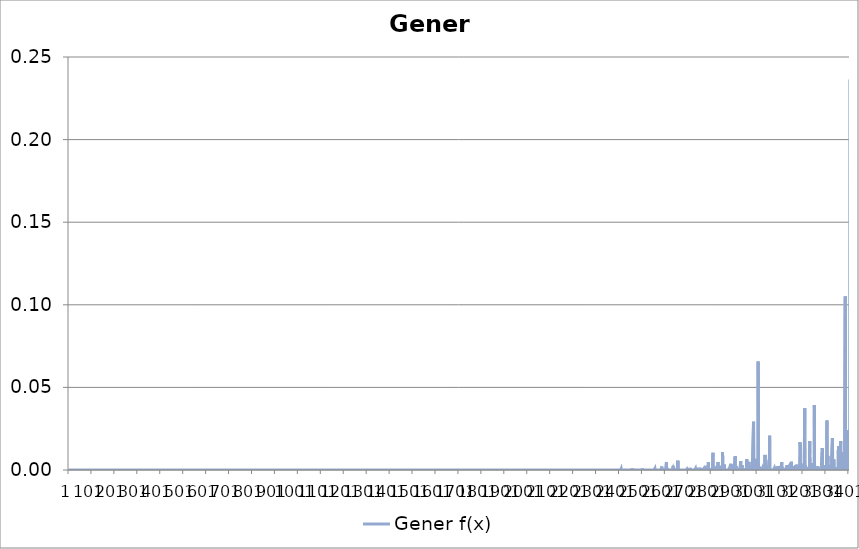
| Category | Gener f(x) |
|---|---|
| 0 | 0 |
| 1 | 0 |
| 2 | 0 |
| 3 | 0 |
| 4 | 0 |
| 5 | 0 |
| 6 | 0 |
| 7 | 0 |
| 8 | 0 |
| 9 | 0 |
| 10 | 0 |
| 11 | 0 |
| 12 | 0 |
| 13 | 0 |
| 14 | 0 |
| 15 | 0 |
| 16 | 0 |
| 17 | 0 |
| 18 | 0 |
| 19 | 0 |
| 20 | 0 |
| 21 | 0 |
| 22 | 0 |
| 23 | 0 |
| 24 | 0 |
| 25 | 0 |
| 26 | 0 |
| 27 | 0 |
| 28 | 0 |
| 29 | 0 |
| 30 | 0 |
| 31 | 0 |
| 32 | 0 |
| 33 | 0 |
| 34 | 0 |
| 35 | 0 |
| 36 | 0 |
| 37 | 0 |
| 38 | 0 |
| 39 | 0 |
| 40 | 0 |
| 41 | 0 |
| 42 | 0 |
| 43 | 0 |
| 44 | 0 |
| 45 | 0 |
| 46 | 0 |
| 47 | 0 |
| 48 | 0 |
| 49 | 0 |
| 50 | 0 |
| 51 | 0 |
| 52 | 0 |
| 53 | 0 |
| 54 | 0 |
| 55 | 0 |
| 56 | 0 |
| 57 | 0 |
| 58 | 0 |
| 59 | 0 |
| 60 | 0 |
| 61 | 0 |
| 62 | 0 |
| 63 | 0 |
| 64 | 0 |
| 65 | 0 |
| 66 | 0 |
| 67 | 0 |
| 68 | 0 |
| 69 | 0 |
| 70 | 0 |
| 71 | 0 |
| 72 | 0 |
| 73 | 0 |
| 74 | 0 |
| 75 | 0 |
| 76 | 0 |
| 77 | 0 |
| 78 | 0 |
| 79 | 0 |
| 80 | 0 |
| 81 | 0 |
| 82 | 0 |
| 83 | 0 |
| 84 | 0 |
| 85 | 0 |
| 86 | 0 |
| 87 | 0 |
| 88 | 0 |
| 89 | 0 |
| 90 | 0 |
| 91 | 0 |
| 92 | 0 |
| 93 | 0 |
| 94 | 0 |
| 95 | 0 |
| 96 | 0 |
| 97 | 0 |
| 98 | 0 |
| 99 | 0 |
| 100 | 0 |
| 101 | 0 |
| 102 | 0 |
| 103 | 0 |
| 104 | 0 |
| 105 | 0 |
| 106 | 0 |
| 107 | 0 |
| 108 | 0 |
| 109 | 0 |
| 110 | 0 |
| 111 | 0 |
| 112 | 0 |
| 113 | 0 |
| 114 | 0 |
| 115 | 0 |
| 116 | 0 |
| 117 | 0 |
| 118 | 0 |
| 119 | 0 |
| 120 | 0 |
| 121 | 0 |
| 122 | 0 |
| 123 | 0 |
| 124 | 0 |
| 125 | 0 |
| 126 | 0 |
| 127 | 0 |
| 128 | 0 |
| 129 | 0 |
| 130 | 0 |
| 131 | 0 |
| 132 | 0 |
| 133 | 0 |
| 134 | 0 |
| 135 | 0 |
| 136 | 0 |
| 137 | 0 |
| 138 | 0 |
| 139 | 0 |
| 140 | 0 |
| 141 | 0 |
| 142 | 0 |
| 143 | 0 |
| 144 | 0 |
| 145 | 0 |
| 146 | 0 |
| 147 | 0 |
| 148 | 0 |
| 149 | 0 |
| 150 | 0 |
| 151 | 0 |
| 152 | 0 |
| 153 | 0 |
| 154 | 0 |
| 155 | 0 |
| 156 | 0 |
| 157 | 0 |
| 158 | 0 |
| 159 | 0 |
| 160 | 0 |
| 161 | 0 |
| 162 | 0 |
| 163 | 0 |
| 164 | 0 |
| 165 | 0 |
| 166 | 0 |
| 167 | 0 |
| 168 | 0 |
| 169 | 0 |
| 170 | 0 |
| 171 | 0 |
| 172 | 0 |
| 173 | 0 |
| 174 | 0 |
| 175 | 0 |
| 176 | 0 |
| 177 | 0 |
| 178 | 0 |
| 179 | 0 |
| 180 | 0 |
| 181 | 0 |
| 182 | 0 |
| 183 | 0 |
| 184 | 0 |
| 185 | 0 |
| 186 | 0 |
| 187 | 0 |
| 188 | 0 |
| 189 | 0 |
| 190 | 0 |
| 191 | 0 |
| 192 | 0 |
| 193 | 0 |
| 194 | 0 |
| 195 | 0 |
| 196 | 0 |
| 197 | 0 |
| 198 | 0 |
| 199 | 0 |
| 200 | 0 |
| 201 | 0 |
| 202 | 0 |
| 203 | 0 |
| 204 | 0 |
| 205 | 0 |
| 206 | 0 |
| 207 | 0 |
| 208 | 0 |
| 209 | 0 |
| 210 | 0 |
| 211 | 0 |
| 212 | 0 |
| 213 | 0 |
| 214 | 0 |
| 215 | 0 |
| 216 | 0 |
| 217 | 0 |
| 218 | 0 |
| 219 | 0 |
| 220 | 0 |
| 221 | 0 |
| 222 | 0 |
| 223 | 0 |
| 224 | 0 |
| 225 | 0 |
| 226 | 0 |
| 227 | 0 |
| 228 | 0 |
| 229 | 0 |
| 230 | 0 |
| 231 | 0 |
| 232 | 0 |
| 233 | 0 |
| 234 | 0 |
| 235 | 0 |
| 236 | 0 |
| 237 | 0 |
| 238 | 0 |
| 239 | 0 |
| 240 | 0 |
| 241 | 0 |
| 242 | 0 |
| 243 | 0 |
| 244 | 0 |
| 245 | 0 |
| 246 | 0 |
| 247 | 0 |
| 248 | 0 |
| 249 | 0 |
| 250 | 0 |
| 251 | 0 |
| 252 | 0 |
| 253 | 0 |
| 254 | 0 |
| 255 | 0 |
| 256 | 0 |
| 257 | 0 |
| 258 | 0 |
| 259 | 0 |
| 260 | 0 |
| 261 | 0 |
| 262 | 0 |
| 263 | 0 |
| 264 | 0 |
| 265 | 0 |
| 266 | 0 |
| 267 | 0 |
| 268 | 0 |
| 269 | 0 |
| 270 | 0 |
| 271 | 0 |
| 272 | 0 |
| 273 | 0 |
| 274 | 0 |
| 275 | 0 |
| 276 | 0 |
| 277 | 0 |
| 278 | 0 |
| 279 | 0 |
| 280 | 0 |
| 281 | 0 |
| 282 | 0 |
| 283 | 0 |
| 284 | 0 |
| 285 | 0 |
| 286 | 0 |
| 287 | 0 |
| 288 | 0 |
| 289 | 0 |
| 290 | 0 |
| 291 | 0 |
| 292 | 0 |
| 293 | 0 |
| 294 | 0 |
| 295 | 0 |
| 296 | 0 |
| 297 | 0 |
| 298 | 0 |
| 299 | 0 |
| 300 | 0 |
| 301 | 0 |
| 302 | 0 |
| 303 | 0 |
| 304 | 0 |
| 305 | 0 |
| 306 | 0 |
| 307 | 0 |
| 308 | 0 |
| 309 | 0 |
| 310 | 0 |
| 311 | 0 |
| 312 | 0 |
| 313 | 0 |
| 314 | 0 |
| 315 | 0 |
| 316 | 0 |
| 317 | 0 |
| 318 | 0 |
| 319 | 0 |
| 320 | 0 |
| 321 | 0 |
| 322 | 0 |
| 323 | 0 |
| 324 | 0 |
| 325 | 0 |
| 326 | 0 |
| 327 | 0 |
| 328 | 0 |
| 329 | 0 |
| 330 | 0 |
| 331 | 0 |
| 332 | 0 |
| 333 | 0 |
| 334 | 0 |
| 335 | 0 |
| 336 | 0 |
| 337 | 0 |
| 338 | 0 |
| 339 | 0 |
| 340 | 0 |
| 341 | 0 |
| 342 | 0 |
| 343 | 0 |
| 344 | 0 |
| 345 | 0 |
| 346 | 0 |
| 347 | 0 |
| 348 | 0 |
| 349 | 0 |
| 350 | 0 |
| 351 | 0 |
| 352 | 0 |
| 353 | 0 |
| 354 | 0 |
| 355 | 0 |
| 356 | 0 |
| 357 | 0 |
| 358 | 0 |
| 359 | 0 |
| 360 | 0 |
| 361 | 0 |
| 362 | 0 |
| 363 | 0 |
| 364 | 0 |
| 365 | 0 |
| 366 | 0 |
| 367 | 0 |
| 368 | 0 |
| 369 | 0 |
| 370 | 0 |
| 371 | 0 |
| 372 | 0 |
| 373 | 0 |
| 374 | 0 |
| 375 | 0 |
| 376 | 0 |
| 377 | 0 |
| 378 | 0 |
| 379 | 0 |
| 380 | 0 |
| 381 | 0 |
| 382 | 0 |
| 383 | 0 |
| 384 | 0 |
| 385 | 0 |
| 386 | 0 |
| 387 | 0 |
| 388 | 0 |
| 389 | 0 |
| 390 | 0 |
| 391 | 0 |
| 392 | 0 |
| 393 | 0 |
| 394 | 0 |
| 395 | 0 |
| 396 | 0 |
| 397 | 0 |
| 398 | 0 |
| 399 | 0 |
| 400 | 0 |
| 401 | 0 |
| 402 | 0 |
| 403 | 0 |
| 404 | 0 |
| 405 | 0 |
| 406 | 0 |
| 407 | 0 |
| 408 | 0 |
| 409 | 0 |
| 410 | 0 |
| 411 | 0 |
| 412 | 0 |
| 413 | 0 |
| 414 | 0 |
| 415 | 0 |
| 416 | 0 |
| 417 | 0 |
| 418 | 0 |
| 419 | 0 |
| 420 | 0 |
| 421 | 0 |
| 422 | 0 |
| 423 | 0 |
| 424 | 0 |
| 425 | 0 |
| 426 | 0 |
| 427 | 0 |
| 428 | 0 |
| 429 | 0 |
| 430 | 0 |
| 431 | 0 |
| 432 | 0 |
| 433 | 0 |
| 434 | 0 |
| 435 | 0 |
| 436 | 0 |
| 437 | 0 |
| 438 | 0 |
| 439 | 0 |
| 440 | 0 |
| 441 | 0 |
| 442 | 0 |
| 443 | 0 |
| 444 | 0 |
| 445 | 0 |
| 446 | 0 |
| 447 | 0 |
| 448 | 0 |
| 449 | 0 |
| 450 | 0 |
| 451 | 0 |
| 452 | 0 |
| 453 | 0 |
| 454 | 0 |
| 455 | 0 |
| 456 | 0 |
| 457 | 0 |
| 458 | 0 |
| 459 | 0 |
| 460 | 0 |
| 461 | 0 |
| 462 | 0 |
| 463 | 0 |
| 464 | 0 |
| 465 | 0 |
| 466 | 0 |
| 467 | 0 |
| 468 | 0 |
| 469 | 0 |
| 470 | 0 |
| 471 | 0 |
| 472 | 0 |
| 473 | 0 |
| 474 | 0 |
| 475 | 0 |
| 476 | 0 |
| 477 | 0 |
| 478 | 0 |
| 479 | 0 |
| 480 | 0 |
| 481 | 0 |
| 482 | 0 |
| 483 | 0 |
| 484 | 0 |
| 485 | 0 |
| 486 | 0 |
| 487 | 0 |
| 488 | 0 |
| 489 | 0 |
| 490 | 0 |
| 491 | 0 |
| 492 | 0 |
| 493 | 0 |
| 494 | 0 |
| 495 | 0 |
| 496 | 0 |
| 497 | 0 |
| 498 | 0 |
| 499 | 0 |
| 500 | 0 |
| 501 | 0 |
| 502 | 0 |
| 503 | 0 |
| 504 | 0 |
| 505 | 0 |
| 506 | 0 |
| 507 | 0 |
| 508 | 0 |
| 509 | 0 |
| 510 | 0 |
| 511 | 0 |
| 512 | 0 |
| 513 | 0 |
| 514 | 0 |
| 515 | 0 |
| 516 | 0 |
| 517 | 0 |
| 518 | 0 |
| 519 | 0 |
| 520 | 0 |
| 521 | 0 |
| 522 | 0 |
| 523 | 0 |
| 524 | 0 |
| 525 | 0 |
| 526 | 0 |
| 527 | 0 |
| 528 | 0 |
| 529 | 0 |
| 530 | 0 |
| 531 | 0 |
| 532 | 0 |
| 533 | 0 |
| 534 | 0 |
| 535 | 0 |
| 536 | 0 |
| 537 | 0 |
| 538 | 0 |
| 539 | 0 |
| 540 | 0 |
| 541 | 0 |
| 542 | 0 |
| 543 | 0 |
| 544 | 0 |
| 545 | 0 |
| 546 | 0 |
| 547 | 0 |
| 548 | 0 |
| 549 | 0 |
| 550 | 0 |
| 551 | 0 |
| 552 | 0 |
| 553 | 0 |
| 554 | 0 |
| 555 | 0 |
| 556 | 0 |
| 557 | 0 |
| 558 | 0 |
| 559 | 0 |
| 560 | 0 |
| 561 | 0 |
| 562 | 0 |
| 563 | 0 |
| 564 | 0 |
| 565 | 0 |
| 566 | 0 |
| 567 | 0 |
| 568 | 0 |
| 569 | 0 |
| 570 | 0 |
| 571 | 0 |
| 572 | 0 |
| 573 | 0 |
| 574 | 0 |
| 575 | 0 |
| 576 | 0 |
| 577 | 0 |
| 578 | 0 |
| 579 | 0 |
| 580 | 0 |
| 581 | 0 |
| 582 | 0 |
| 583 | 0 |
| 584 | 0 |
| 585 | 0 |
| 586 | 0 |
| 587 | 0 |
| 588 | 0 |
| 589 | 0 |
| 590 | 0 |
| 591 | 0 |
| 592 | 0 |
| 593 | 0 |
| 594 | 0 |
| 595 | 0 |
| 596 | 0 |
| 597 | 0 |
| 598 | 0 |
| 599 | 0 |
| 600 | 0 |
| 601 | 0 |
| 602 | 0 |
| 603 | 0 |
| 604 | 0 |
| 605 | 0 |
| 606 | 0 |
| 607 | 0 |
| 608 | 0 |
| 609 | 0 |
| 610 | 0 |
| 611 | 0 |
| 612 | 0 |
| 613 | 0 |
| 614 | 0 |
| 615 | 0 |
| 616 | 0 |
| 617 | 0 |
| 618 | 0 |
| 619 | 0 |
| 620 | 0 |
| 621 | 0 |
| 622 | 0 |
| 623 | 0 |
| 624 | 0 |
| 625 | 0 |
| 626 | 0 |
| 627 | 0 |
| 628 | 0 |
| 629 | 0 |
| 630 | 0 |
| 631 | 0 |
| 632 | 0 |
| 633 | 0 |
| 634 | 0 |
| 635 | 0 |
| 636 | 0 |
| 637 | 0 |
| 638 | 0 |
| 639 | 0 |
| 640 | 0 |
| 641 | 0 |
| 642 | 0 |
| 643 | 0 |
| 644 | 0 |
| 645 | 0 |
| 646 | 0 |
| 647 | 0 |
| 648 | 0 |
| 649 | 0 |
| 650 | 0 |
| 651 | 0 |
| 652 | 0 |
| 653 | 0 |
| 654 | 0 |
| 655 | 0 |
| 656 | 0 |
| 657 | 0 |
| 658 | 0 |
| 659 | 0 |
| 660 | 0 |
| 661 | 0 |
| 662 | 0 |
| 663 | 0 |
| 664 | 0 |
| 665 | 0 |
| 666 | 0 |
| 667 | 0 |
| 668 | 0 |
| 669 | 0 |
| 670 | 0 |
| 671 | 0 |
| 672 | 0 |
| 673 | 0 |
| 674 | 0 |
| 675 | 0 |
| 676 | 0 |
| 677 | 0 |
| 678 | 0 |
| 679 | 0 |
| 680 | 0 |
| 681 | 0 |
| 682 | 0 |
| 683 | 0 |
| 684 | 0 |
| 685 | 0 |
| 686 | 0 |
| 687 | 0 |
| 688 | 0 |
| 689 | 0 |
| 690 | 0 |
| 691 | 0 |
| 692 | 0 |
| 693 | 0 |
| 694 | 0 |
| 695 | 0 |
| 696 | 0 |
| 697 | 0 |
| 698 | 0 |
| 699 | 0 |
| 700 | 0 |
| 701 | 0 |
| 702 | 0 |
| 703 | 0 |
| 704 | 0 |
| 705 | 0 |
| 706 | 0 |
| 707 | 0 |
| 708 | 0 |
| 709 | 0 |
| 710 | 0 |
| 711 | 0 |
| 712 | 0 |
| 713 | 0 |
| 714 | 0 |
| 715 | 0 |
| 716 | 0 |
| 717 | 0 |
| 718 | 0 |
| 719 | 0 |
| 720 | 0 |
| 721 | 0 |
| 722 | 0 |
| 723 | 0 |
| 724 | 0 |
| 725 | 0 |
| 726 | 0 |
| 727 | 0 |
| 728 | 0 |
| 729 | 0 |
| 730 | 0 |
| 731 | 0 |
| 732 | 0 |
| 733 | 0 |
| 734 | 0 |
| 735 | 0 |
| 736 | 0 |
| 737 | 0 |
| 738 | 0 |
| 739 | 0 |
| 740 | 0 |
| 741 | 0 |
| 742 | 0 |
| 743 | 0 |
| 744 | 0 |
| 745 | 0 |
| 746 | 0 |
| 747 | 0 |
| 748 | 0 |
| 749 | 0 |
| 750 | 0 |
| 751 | 0 |
| 752 | 0 |
| 753 | 0 |
| 754 | 0 |
| 755 | 0 |
| 756 | 0 |
| 757 | 0 |
| 758 | 0 |
| 759 | 0 |
| 760 | 0 |
| 761 | 0 |
| 762 | 0 |
| 763 | 0 |
| 764 | 0 |
| 765 | 0 |
| 766 | 0 |
| 767 | 0 |
| 768 | 0 |
| 769 | 0 |
| 770 | 0 |
| 771 | 0 |
| 772 | 0 |
| 773 | 0 |
| 774 | 0 |
| 775 | 0 |
| 776 | 0 |
| 777 | 0 |
| 778 | 0 |
| 779 | 0 |
| 780 | 0 |
| 781 | 0 |
| 782 | 0 |
| 783 | 0 |
| 784 | 0 |
| 785 | 0 |
| 786 | 0 |
| 787 | 0 |
| 788 | 0 |
| 789 | 0 |
| 790 | 0 |
| 791 | 0 |
| 792 | 0 |
| 793 | 0 |
| 794 | 0 |
| 795 | 0 |
| 796 | 0 |
| 797 | 0 |
| 798 | 0 |
| 799 | 0 |
| 800 | 0 |
| 801 | 0 |
| 802 | 0 |
| 803 | 0 |
| 804 | 0 |
| 805 | 0 |
| 806 | 0 |
| 807 | 0 |
| 808 | 0 |
| 809 | 0 |
| 810 | 0 |
| 811 | 0 |
| 812 | 0 |
| 813 | 0 |
| 814 | 0 |
| 815 | 0 |
| 816 | 0 |
| 817 | 0 |
| 818 | 0 |
| 819 | 0 |
| 820 | 0 |
| 821 | 0 |
| 822 | 0 |
| 823 | 0 |
| 824 | 0 |
| 825 | 0 |
| 826 | 0 |
| 827 | 0 |
| 828 | 0 |
| 829 | 0 |
| 830 | 0 |
| 831 | 0 |
| 832 | 0 |
| 833 | 0 |
| 834 | 0 |
| 835 | 0 |
| 836 | 0 |
| 837 | 0 |
| 838 | 0 |
| 839 | 0 |
| 840 | 0 |
| 841 | 0 |
| 842 | 0 |
| 843 | 0 |
| 844 | 0 |
| 845 | 0 |
| 846 | 0 |
| 847 | 0 |
| 848 | 0 |
| 849 | 0 |
| 850 | 0 |
| 851 | 0 |
| 852 | 0 |
| 853 | 0 |
| 854 | 0 |
| 855 | 0 |
| 856 | 0 |
| 857 | 0 |
| 858 | 0 |
| 859 | 0 |
| 860 | 0 |
| 861 | 0 |
| 862 | 0 |
| 863 | 0 |
| 864 | 0 |
| 865 | 0 |
| 866 | 0 |
| 867 | 0 |
| 868 | 0 |
| 869 | 0 |
| 870 | 0 |
| 871 | 0 |
| 872 | 0 |
| 873 | 0 |
| 874 | 0 |
| 875 | 0 |
| 876 | 0 |
| 877 | 0 |
| 878 | 0 |
| 879 | 0 |
| 880 | 0 |
| 881 | 0 |
| 882 | 0 |
| 883 | 0 |
| 884 | 0 |
| 885 | 0 |
| 886 | 0 |
| 887 | 0 |
| 888 | 0 |
| 889 | 0 |
| 890 | 0 |
| 891 | 0 |
| 892 | 0 |
| 893 | 0 |
| 894 | 0 |
| 895 | 0 |
| 896 | 0 |
| 897 | 0 |
| 898 | 0 |
| 899 | 0 |
| 900 | 0 |
| 901 | 0 |
| 902 | 0 |
| 903 | 0 |
| 904 | 0 |
| 905 | 0 |
| 906 | 0 |
| 907 | 0 |
| 908 | 0 |
| 909 | 0 |
| 910 | 0 |
| 911 | 0 |
| 912 | 0 |
| 913 | 0 |
| 914 | 0 |
| 915 | 0 |
| 916 | 0 |
| 917 | 0 |
| 918 | 0 |
| 919 | 0 |
| 920 | 0 |
| 921 | 0 |
| 922 | 0 |
| 923 | 0 |
| 924 | 0 |
| 925 | 0 |
| 926 | 0 |
| 927 | 0 |
| 928 | 0 |
| 929 | 0 |
| 930 | 0 |
| 931 | 0 |
| 932 | 0 |
| 933 | 0 |
| 934 | 0 |
| 935 | 0 |
| 936 | 0 |
| 937 | 0 |
| 938 | 0 |
| 939 | 0 |
| 940 | 0 |
| 941 | 0 |
| 942 | 0 |
| 943 | 0 |
| 944 | 0 |
| 945 | 0 |
| 946 | 0 |
| 947 | 0 |
| 948 | 0 |
| 949 | 0 |
| 950 | 0 |
| 951 | 0 |
| 952 | 0 |
| 953 | 0 |
| 954 | 0 |
| 955 | 0 |
| 956 | 0 |
| 957 | 0 |
| 958 | 0 |
| 959 | 0 |
| 960 | 0 |
| 961 | 0 |
| 962 | 0 |
| 963 | 0 |
| 964 | 0 |
| 965 | 0 |
| 966 | 0 |
| 967 | 0 |
| 968 | 0 |
| 969 | 0 |
| 970 | 0 |
| 971 | 0 |
| 972 | 0 |
| 973 | 0 |
| 974 | 0 |
| 975 | 0 |
| 976 | 0 |
| 977 | 0 |
| 978 | 0 |
| 979 | 0 |
| 980 | 0 |
| 981 | 0 |
| 982 | 0 |
| 983 | 0 |
| 984 | 0 |
| 985 | 0 |
| 986 | 0 |
| 987 | 0 |
| 988 | 0 |
| 989 | 0 |
| 990 | 0 |
| 991 | 0 |
| 992 | 0 |
| 993 | 0 |
| 994 | 0 |
| 995 | 0 |
| 996 | 0 |
| 997 | 0 |
| 998 | 0 |
| 999 | 0 |
| 1000 | 0 |
| 1001 | 0 |
| 1002 | 0 |
| 1003 | 0 |
| 1004 | 0 |
| 1005 | 0 |
| 1006 | 0 |
| 1007 | 0 |
| 1008 | 0 |
| 1009 | 0 |
| 1010 | 0 |
| 1011 | 0 |
| 1012 | 0 |
| 1013 | 0 |
| 1014 | 0 |
| 1015 | 0 |
| 1016 | 0 |
| 1017 | 0 |
| 1018 | 0 |
| 1019 | 0 |
| 1020 | 0 |
| 1021 | 0 |
| 1022 | 0 |
| 1023 | 0 |
| 1024 | 0 |
| 1025 | 0 |
| 1026 | 0 |
| 1027 | 0 |
| 1028 | 0 |
| 1029 | 0 |
| 1030 | 0 |
| 1031 | 0 |
| 1032 | 0 |
| 1033 | 0 |
| 1034 | 0 |
| 1035 | 0 |
| 1036 | 0 |
| 1037 | 0 |
| 1038 | 0 |
| 1039 | 0 |
| 1040 | 0 |
| 1041 | 0 |
| 1042 | 0 |
| 1043 | 0 |
| 1044 | 0 |
| 1045 | 0 |
| 1046 | 0 |
| 1047 | 0 |
| 1048 | 0 |
| 1049 | 0 |
| 1050 | 0 |
| 1051 | 0 |
| 1052 | 0 |
| 1053 | 0 |
| 1054 | 0 |
| 1055 | 0 |
| 1056 | 0 |
| 1057 | 0 |
| 1058 | 0 |
| 1059 | 0 |
| 1060 | 0 |
| 1061 | 0 |
| 1062 | 0 |
| 1063 | 0 |
| 1064 | 0 |
| 1065 | 0 |
| 1066 | 0 |
| 1067 | 0 |
| 1068 | 0 |
| 1069 | 0 |
| 1070 | 0 |
| 1071 | 0 |
| 1072 | 0 |
| 1073 | 0 |
| 1074 | 0 |
| 1075 | 0 |
| 1076 | 0 |
| 1077 | 0 |
| 1078 | 0 |
| 1079 | 0 |
| 1080 | 0 |
| 1081 | 0 |
| 1082 | 0 |
| 1083 | 0 |
| 1084 | 0 |
| 1085 | 0 |
| 1086 | 0 |
| 1087 | 0 |
| 1088 | 0 |
| 1089 | 0 |
| 1090 | 0 |
| 1091 | 0 |
| 1092 | 0 |
| 1093 | 0 |
| 1094 | 0 |
| 1095 | 0 |
| 1096 | 0 |
| 1097 | 0 |
| 1098 | 0 |
| 1099 | 0 |
| 1100 | 0 |
| 1101 | 0 |
| 1102 | 0 |
| 1103 | 0 |
| 1104 | 0 |
| 1105 | 0 |
| 1106 | 0 |
| 1107 | 0 |
| 1108 | 0 |
| 1109 | 0 |
| 1110 | 0 |
| 1111 | 0 |
| 1112 | 0 |
| 1113 | 0 |
| 1114 | 0 |
| 1115 | 0 |
| 1116 | 0 |
| 1117 | 0 |
| 1118 | 0 |
| 1119 | 0 |
| 1120 | 0 |
| 1121 | 0 |
| 1122 | 0 |
| 1123 | 0 |
| 1124 | 0 |
| 1125 | 0 |
| 1126 | 0 |
| 1127 | 0 |
| 1128 | 0 |
| 1129 | 0 |
| 1130 | 0 |
| 1131 | 0 |
| 1132 | 0 |
| 1133 | 0 |
| 1134 | 0 |
| 1135 | 0 |
| 1136 | 0 |
| 1137 | 0 |
| 1138 | 0 |
| 1139 | 0 |
| 1140 | 0 |
| 1141 | 0 |
| 1142 | 0 |
| 1143 | 0 |
| 1144 | 0 |
| 1145 | 0 |
| 1146 | 0 |
| 1147 | 0 |
| 1148 | 0 |
| 1149 | 0 |
| 1150 | 0 |
| 1151 | 0 |
| 1152 | 0 |
| 1153 | 0 |
| 1154 | 0 |
| 1155 | 0 |
| 1156 | 0 |
| 1157 | 0 |
| 1158 | 0 |
| 1159 | 0 |
| 1160 | 0 |
| 1161 | 0 |
| 1162 | 0 |
| 1163 | 0 |
| 1164 | 0 |
| 1165 | 0 |
| 1166 | 0 |
| 1167 | 0 |
| 1168 | 0 |
| 1169 | 0 |
| 1170 | 0 |
| 1171 | 0 |
| 1172 | 0 |
| 1173 | 0 |
| 1174 | 0 |
| 1175 | 0 |
| 1176 | 0 |
| 1177 | 0 |
| 1178 | 0 |
| 1179 | 0 |
| 1180 | 0 |
| 1181 | 0 |
| 1182 | 0 |
| 1183 | 0 |
| 1184 | 0 |
| 1185 | 0 |
| 1186 | 0 |
| 1187 | 0 |
| 1188 | 0 |
| 1189 | 0 |
| 1190 | 0 |
| 1191 | 0 |
| 1192 | 0 |
| 1193 | 0 |
| 1194 | 0 |
| 1195 | 0 |
| 1196 | 0 |
| 1197 | 0 |
| 1198 | 0 |
| 1199 | 0 |
| 1200 | 0 |
| 1201 | 0 |
| 1202 | 0 |
| 1203 | 0 |
| 1204 | 0 |
| 1205 | 0 |
| 1206 | 0 |
| 1207 | 0 |
| 1208 | 0 |
| 1209 | 0 |
| 1210 | 0 |
| 1211 | 0 |
| 1212 | 0 |
| 1213 | 0 |
| 1214 | 0 |
| 1215 | 0 |
| 1216 | 0 |
| 1217 | 0 |
| 1218 | 0 |
| 1219 | 0 |
| 1220 | 0 |
| 1221 | 0 |
| 1222 | 0 |
| 1223 | 0 |
| 1224 | 0 |
| 1225 | 0 |
| 1226 | 0 |
| 1227 | 0 |
| 1228 | 0 |
| 1229 | 0 |
| 1230 | 0 |
| 1231 | 0 |
| 1232 | 0 |
| 1233 | 0 |
| 1234 | 0 |
| 1235 | 0 |
| 1236 | 0 |
| 1237 | 0 |
| 1238 | 0 |
| 1239 | 0 |
| 1240 | 0 |
| 1241 | 0 |
| 1242 | 0 |
| 1243 | 0 |
| 1244 | 0 |
| 1245 | 0 |
| 1246 | 0 |
| 1247 | 0 |
| 1248 | 0 |
| 1249 | 0 |
| 1250 | 0 |
| 1251 | 0 |
| 1252 | 0 |
| 1253 | 0 |
| 1254 | 0 |
| 1255 | 0 |
| 1256 | 0 |
| 1257 | 0 |
| 1258 | 0 |
| 1259 | 0 |
| 1260 | 0 |
| 1261 | 0 |
| 1262 | 0 |
| 1263 | 0 |
| 1264 | 0 |
| 1265 | 0 |
| 1266 | 0 |
| 1267 | 0 |
| 1268 | 0 |
| 1269 | 0 |
| 1270 | 0 |
| 1271 | 0 |
| 1272 | 0 |
| 1273 | 0 |
| 1274 | 0 |
| 1275 | 0 |
| 1276 | 0 |
| 1277 | 0 |
| 1278 | 0 |
| 1279 | 0 |
| 1280 | 0 |
| 1281 | 0 |
| 1282 | 0 |
| 1283 | 0 |
| 1284 | 0 |
| 1285 | 0 |
| 1286 | 0 |
| 1287 | 0 |
| 1288 | 0 |
| 1289 | 0 |
| 1290 | 0 |
| 1291 | 0 |
| 1292 | 0 |
| 1293 | 0 |
| 1294 | 0 |
| 1295 | 0 |
| 1296 | 0 |
| 1297 | 0 |
| 1298 | 0 |
| 1299 | 0 |
| 1300 | 0 |
| 1301 | 0 |
| 1302 | 0 |
| 1303 | 0 |
| 1304 | 0 |
| 1305 | 0 |
| 1306 | 0 |
| 1307 | 0 |
| 1308 | 0 |
| 1309 | 0 |
| 1310 | 0 |
| 1311 | 0 |
| 1312 | 0 |
| 1313 | 0 |
| 1314 | 0 |
| 1315 | 0 |
| 1316 | 0 |
| 1317 | 0 |
| 1318 | 0 |
| 1319 | 0 |
| 1320 | 0 |
| 1321 | 0 |
| 1322 | 0 |
| 1323 | 0 |
| 1324 | 0 |
| 1325 | 0 |
| 1326 | 0 |
| 1327 | 0 |
| 1328 | 0 |
| 1329 | 0 |
| 1330 | 0 |
| 1331 | 0 |
| 1332 | 0 |
| 1333 | 0 |
| 1334 | 0 |
| 1335 | 0 |
| 1336 | 0 |
| 1337 | 0 |
| 1338 | 0 |
| 1339 | 0 |
| 1340 | 0 |
| 1341 | 0 |
| 1342 | 0 |
| 1343 | 0 |
| 1344 | 0 |
| 1345 | 0 |
| 1346 | 0 |
| 1347 | 0 |
| 1348 | 0 |
| 1349 | 0 |
| 1350 | 0 |
| 1351 | 0 |
| 1352 | 0 |
| 1353 | 0 |
| 1354 | 0 |
| 1355 | 0 |
| 1356 | 0 |
| 1357 | 0 |
| 1358 | 0 |
| 1359 | 0 |
| 1360 | 0 |
| 1361 | 0 |
| 1362 | 0 |
| 1363 | 0 |
| 1364 | 0 |
| 1365 | 0 |
| 1366 | 0 |
| 1367 | 0 |
| 1368 | 0 |
| 1369 | 0 |
| 1370 | 0 |
| 1371 | 0 |
| 1372 | 0 |
| 1373 | 0 |
| 1374 | 0 |
| 1375 | 0 |
| 1376 | 0 |
| 1377 | 0 |
| 1378 | 0 |
| 1379 | 0 |
| 1380 | 0 |
| 1381 | 0 |
| 1382 | 0 |
| 1383 | 0 |
| 1384 | 0 |
| 1385 | 0 |
| 1386 | 0 |
| 1387 | 0 |
| 1388 | 0 |
| 1389 | 0 |
| 1390 | 0 |
| 1391 | 0 |
| 1392 | 0 |
| 1393 | 0 |
| 1394 | 0 |
| 1395 | 0 |
| 1396 | 0 |
| 1397 | 0 |
| 1398 | 0 |
| 1399 | 0 |
| 1400 | 0 |
| 1401 | 0 |
| 1402 | 0 |
| 1403 | 0 |
| 1404 | 0 |
| 1405 | 0 |
| 1406 | 0 |
| 1407 | 0 |
| 1408 | 0 |
| 1409 | 0 |
| 1410 | 0 |
| 1411 | 0 |
| 1412 | 0 |
| 1413 | 0 |
| 1414 | 0 |
| 1415 | 0 |
| 1416 | 0 |
| 1417 | 0 |
| 1418 | 0 |
| 1419 | 0 |
| 1420 | 0 |
| 1421 | 0 |
| 1422 | 0 |
| 1423 | 0 |
| 1424 | 0 |
| 1425 | 0 |
| 1426 | 0 |
| 1427 | 0 |
| 1428 | 0 |
| 1429 | 0 |
| 1430 | 0 |
| 1431 | 0 |
| 1432 | 0 |
| 1433 | 0 |
| 1434 | 0 |
| 1435 | 0 |
| 1436 | 0 |
| 1437 | 0 |
| 1438 | 0 |
| 1439 | 0 |
| 1440 | 0 |
| 1441 | 0 |
| 1442 | 0 |
| 1443 | 0 |
| 1444 | 0 |
| 1445 | 0 |
| 1446 | 0 |
| 1447 | 0 |
| 1448 | 0 |
| 1449 | 0 |
| 1450 | 0 |
| 1451 | 0 |
| 1452 | 0 |
| 1453 | 0 |
| 1454 | 0 |
| 1455 | 0 |
| 1456 | 0 |
| 1457 | 0 |
| 1458 | 0 |
| 1459 | 0 |
| 1460 | 0 |
| 1461 | 0 |
| 1462 | 0 |
| 1463 | 0 |
| 1464 | 0 |
| 1465 | 0 |
| 1466 | 0 |
| 1467 | 0 |
| 1468 | 0 |
| 1469 | 0 |
| 1470 | 0 |
| 1471 | 0 |
| 1472 | 0 |
| 1473 | 0 |
| 1474 | 0 |
| 1475 | 0 |
| 1476 | 0 |
| 1477 | 0 |
| 1478 | 0 |
| 1479 | 0 |
| 1480 | 0 |
| 1481 | 0 |
| 1482 | 0 |
| 1483 | 0 |
| 1484 | 0 |
| 1485 | 0 |
| 1486 | 0 |
| 1487 | 0 |
| 1488 | 0 |
| 1489 | 0 |
| 1490 | 0 |
| 1491 | 0 |
| 1492 | 0 |
| 1493 | 0 |
| 1494 | 0 |
| 1495 | 0 |
| 1496 | 0 |
| 1497 | 0 |
| 1498 | 0 |
| 1499 | 0 |
| 1500 | 0 |
| 1501 | 0 |
| 1502 | 0 |
| 1503 | 0 |
| 1504 | 0 |
| 1505 | 0 |
| 1506 | 0 |
| 1507 | 0 |
| 1508 | 0 |
| 1509 | 0 |
| 1510 | 0 |
| 1511 | 0 |
| 1512 | 0 |
| 1513 | 0 |
| 1514 | 0 |
| 1515 | 0 |
| 1516 | 0 |
| 1517 | 0 |
| 1518 | 0 |
| 1519 | 0 |
| 1520 | 0 |
| 1521 | 0 |
| 1522 | 0 |
| 1523 | 0 |
| 1524 | 0 |
| 1525 | 0 |
| 1526 | 0 |
| 1527 | 0 |
| 1528 | 0 |
| 1529 | 0 |
| 1530 | 0 |
| 1531 | 0 |
| 1532 | 0 |
| 1533 | 0 |
| 1534 | 0 |
| 1535 | 0 |
| 1536 | 0 |
| 1537 | 0 |
| 1538 | 0 |
| 1539 | 0 |
| 1540 | 0 |
| 1541 | 0 |
| 1542 | 0 |
| 1543 | 0 |
| 1544 | 0 |
| 1545 | 0 |
| 1546 | 0 |
| 1547 | 0 |
| 1548 | 0 |
| 1549 | 0 |
| 1550 | 0 |
| 1551 | 0 |
| 1552 | 0 |
| 1553 | 0 |
| 1554 | 0 |
| 1555 | 0 |
| 1556 | 0 |
| 1557 | 0 |
| 1558 | 0 |
| 1559 | 0 |
| 1560 | 0 |
| 1561 | 0 |
| 1562 | 0 |
| 1563 | 0 |
| 1564 | 0 |
| 1565 | 0 |
| 1566 | 0 |
| 1567 | 0 |
| 1568 | 0 |
| 1569 | 0 |
| 1570 | 0 |
| 1571 | 0 |
| 1572 | 0 |
| 1573 | 0 |
| 1574 | 0 |
| 1575 | 0 |
| 1576 | 0 |
| 1577 | 0 |
| 1578 | 0 |
| 1579 | 0 |
| 1580 | 0 |
| 1581 | 0 |
| 1582 | 0 |
| 1583 | 0 |
| 1584 | 0 |
| 1585 | 0 |
| 1586 | 0 |
| 1587 | 0 |
| 1588 | 0 |
| 1589 | 0 |
| 1590 | 0 |
| 1591 | 0 |
| 1592 | 0 |
| 1593 | 0 |
| 1594 | 0 |
| 1595 | 0 |
| 1596 | 0 |
| 1597 | 0 |
| 1598 | 0 |
| 1599 | 0 |
| 1600 | 0 |
| 1601 | 0 |
| 1602 | 0 |
| 1603 | 0 |
| 1604 | 0 |
| 1605 | 0 |
| 1606 | 0 |
| 1607 | 0 |
| 1608 | 0 |
| 1609 | 0 |
| 1610 | 0 |
| 1611 | 0 |
| 1612 | 0 |
| 1613 | 0 |
| 1614 | 0 |
| 1615 | 0 |
| 1616 | 0 |
| 1617 | 0 |
| 1618 | 0 |
| 1619 | 0 |
| 1620 | 0 |
| 1621 | 0 |
| 1622 | 0 |
| 1623 | 0 |
| 1624 | 0 |
| 1625 | 0 |
| 1626 | 0 |
| 1627 | 0 |
| 1628 | 0 |
| 1629 | 0 |
| 1630 | 0 |
| 1631 | 0 |
| 1632 | 0 |
| 1633 | 0 |
| 1634 | 0 |
| 1635 | 0 |
| 1636 | 0 |
| 1637 | 0 |
| 1638 | 0 |
| 1639 | 0 |
| 1640 | 0 |
| 1641 | 0 |
| 1642 | 0 |
| 1643 | 0 |
| 1644 | 0 |
| 1645 | 0 |
| 1646 | 0 |
| 1647 | 0 |
| 1648 | 0 |
| 1649 | 0 |
| 1650 | 0 |
| 1651 | 0 |
| 1652 | 0 |
| 1653 | 0 |
| 1654 | 0 |
| 1655 | 0 |
| 1656 | 0 |
| 1657 | 0 |
| 1658 | 0 |
| 1659 | 0 |
| 1660 | 0 |
| 1661 | 0 |
| 1662 | 0 |
| 1663 | 0 |
| 1664 | 0 |
| 1665 | 0 |
| 1666 | 0 |
| 1667 | 0 |
| 1668 | 0 |
| 1669 | 0 |
| 1670 | 0 |
| 1671 | 0 |
| 1672 | 0 |
| 1673 | 0 |
| 1674 | 0 |
| 1675 | 0 |
| 1676 | 0 |
| 1677 | 0 |
| 1678 | 0 |
| 1679 | 0 |
| 1680 | 0 |
| 1681 | 0 |
| 1682 | 0 |
| 1683 | 0 |
| 1684 | 0 |
| 1685 | 0 |
| 1686 | 0 |
| 1687 | 0 |
| 1688 | 0 |
| 1689 | 0 |
| 1690 | 0 |
| 1691 | 0 |
| 1692 | 0 |
| 1693 | 0 |
| 1694 | 0 |
| 1695 | 0 |
| 1696 | 0 |
| 1697 | 0 |
| 1698 | 0 |
| 1699 | 0 |
| 1700 | 0 |
| 1701 | 0 |
| 1702 | 0 |
| 1703 | 0 |
| 1704 | 0 |
| 1705 | 0 |
| 1706 | 0 |
| 1707 | 0 |
| 1708 | 0 |
| 1709 | 0 |
| 1710 | 0 |
| 1711 | 0 |
| 1712 | 0 |
| 1713 | 0 |
| 1714 | 0 |
| 1715 | 0 |
| 1716 | 0 |
| 1717 | 0 |
| 1718 | 0 |
| 1719 | 0 |
| 1720 | 0 |
| 1721 | 0 |
| 1722 | 0 |
| 1723 | 0 |
| 1724 | 0 |
| 1725 | 0 |
| 1726 | 0 |
| 1727 | 0 |
| 1728 | 0 |
| 1729 | 0 |
| 1730 | 0 |
| 1731 | 0 |
| 1732 | 0 |
| 1733 | 0 |
| 1734 | 0 |
| 1735 | 0 |
| 1736 | 0 |
| 1737 | 0 |
| 1738 | 0 |
| 1739 | 0 |
| 1740 | 0 |
| 1741 | 0 |
| 1742 | 0 |
| 1743 | 0 |
| 1744 | 0 |
| 1745 | 0 |
| 1746 | 0 |
| 1747 | 0 |
| 1748 | 0 |
| 1749 | 0 |
| 1750 | 0 |
| 1751 | 0 |
| 1752 | 0 |
| 1753 | 0 |
| 1754 | 0 |
| 1755 | 0 |
| 1756 | 0 |
| 1757 | 0 |
| 1758 | 0 |
| 1759 | 0 |
| 1760 | 0 |
| 1761 | 0 |
| 1762 | 0 |
| 1763 | 0 |
| 1764 | 0 |
| 1765 | 0 |
| 1766 | 0 |
| 1767 | 0 |
| 1768 | 0 |
| 1769 | 0 |
| 1770 | 0 |
| 1771 | 0 |
| 1772 | 0 |
| 1773 | 0 |
| 1774 | 0 |
| 1775 | 0 |
| 1776 | 0 |
| 1777 | 0 |
| 1778 | 0 |
| 1779 | 0 |
| 1780 | 0 |
| 1781 | 0 |
| 1782 | 0 |
| 1783 | 0 |
| 1784 | 0 |
| 1785 | 0 |
| 1786 | 0 |
| 1787 | 0 |
| 1788 | 0 |
| 1789 | 0 |
| 1790 | 0 |
| 1791 | 0 |
| 1792 | 0 |
| 1793 | 0 |
| 1794 | 0 |
| 1795 | 0 |
| 1796 | 0 |
| 1797 | 0 |
| 1798 | 0 |
| 1799 | 0 |
| 1800 | 0 |
| 1801 | 0 |
| 1802 | 0 |
| 1803 | 0 |
| 1804 | 0 |
| 1805 | 0 |
| 1806 | 0 |
| 1807 | 0 |
| 1808 | 0 |
| 1809 | 0 |
| 1810 | 0 |
| 1811 | 0 |
| 1812 | 0 |
| 1813 | 0 |
| 1814 | 0 |
| 1815 | 0 |
| 1816 | 0 |
| 1817 | 0 |
| 1818 | 0 |
| 1819 | 0 |
| 1820 | 0 |
| 1821 | 0 |
| 1822 | 0 |
| 1823 | 0 |
| 1824 | 0 |
| 1825 | 0 |
| 1826 | 0 |
| 1827 | 0 |
| 1828 | 0 |
| 1829 | 0 |
| 1830 | 0 |
| 1831 | 0 |
| 1832 | 0 |
| 1833 | 0 |
| 1834 | 0 |
| 1835 | 0 |
| 1836 | 0 |
| 1837 | 0 |
| 1838 | 0 |
| 1839 | 0 |
| 1840 | 0 |
| 1841 | 0 |
| 1842 | 0 |
| 1843 | 0 |
| 1844 | 0 |
| 1845 | 0 |
| 1846 | 0 |
| 1847 | 0 |
| 1848 | 0 |
| 1849 | 0 |
| 1850 | 0 |
| 1851 | 0 |
| 1852 | 0 |
| 1853 | 0 |
| 1854 | 0 |
| 1855 | 0 |
| 1856 | 0 |
| 1857 | 0 |
| 1858 | 0 |
| 1859 | 0 |
| 1860 | 0 |
| 1861 | 0 |
| 1862 | 0 |
| 1863 | 0 |
| 1864 | 0 |
| 1865 | 0 |
| 1866 | 0 |
| 1867 | 0 |
| 1868 | 0 |
| 1869 | 0 |
| 1870 | 0 |
| 1871 | 0 |
| 1872 | 0 |
| 1873 | 0 |
| 1874 | 0 |
| 1875 | 0 |
| 1876 | 0 |
| 1877 | 0 |
| 1878 | 0 |
| 1879 | 0 |
| 1880 | 0 |
| 1881 | 0 |
| 1882 | 0 |
| 1883 | 0 |
| 1884 | 0 |
| 1885 | 0 |
| 1886 | 0 |
| 1887 | 0 |
| 1888 | 0 |
| 1889 | 0 |
| 1890 | 0 |
| 1891 | 0 |
| 1892 | 0 |
| 1893 | 0 |
| 1894 | 0 |
| 1895 | 0 |
| 1896 | 0 |
| 1897 | 0 |
| 1898 | 0 |
| 1899 | 0 |
| 1900 | 0 |
| 1901 | 0 |
| 1902 | 0 |
| 1903 | 0 |
| 1904 | 0 |
| 1905 | 0 |
| 1906 | 0 |
| 1907 | 0 |
| 1908 | 0 |
| 1909 | 0 |
| 1910 | 0 |
| 1911 | 0 |
| 1912 | 0 |
| 1913 | 0 |
| 1914 | 0 |
| 1915 | 0 |
| 1916 | 0 |
| 1917 | 0 |
| 1918 | 0 |
| 1919 | 0 |
| 1920 | 0 |
| 1921 | 0 |
| 1922 | 0 |
| 1923 | 0 |
| 1924 | 0 |
| 1925 | 0 |
| 1926 | 0 |
| 1927 | 0 |
| 1928 | 0 |
| 1929 | 0 |
| 1930 | 0 |
| 1931 | 0 |
| 1932 | 0 |
| 1933 | 0 |
| 1934 | 0 |
| 1935 | 0 |
| 1936 | 0 |
| 1937 | 0 |
| 1938 | 0 |
| 1939 | 0 |
| 1940 | 0 |
| 1941 | 0 |
| 1942 | 0 |
| 1943 | 0 |
| 1944 | 0 |
| 1945 | 0 |
| 1946 | 0 |
| 1947 | 0 |
| 1948 | 0 |
| 1949 | 0 |
| 1950 | 0 |
| 1951 | 0 |
| 1952 | 0 |
| 1953 | 0 |
| 1954 | 0 |
| 1955 | 0 |
| 1956 | 0 |
| 1957 | 0 |
| 1958 | 0 |
| 1959 | 0 |
| 1960 | 0 |
| 1961 | 0 |
| 1962 | 0 |
| 1963 | 0 |
| 1964 | 0 |
| 1965 | 0 |
| 1966 | 0 |
| 1967 | 0 |
| 1968 | 0 |
| 1969 | 0 |
| 1970 | 0 |
| 1971 | 0 |
| 1972 | 0 |
| 1973 | 0 |
| 1974 | 0 |
| 1975 | 0 |
| 1976 | 0 |
| 1977 | 0 |
| 1978 | 0 |
| 1979 | 0 |
| 1980 | 0 |
| 1981 | 0 |
| 1982 | 0 |
| 1983 | 0 |
| 1984 | 0 |
| 1985 | 0 |
| 1986 | 0 |
| 1987 | 0 |
| 1988 | 0 |
| 1989 | 0 |
| 1990 | 0 |
| 1991 | 0 |
| 1992 | 0 |
| 1993 | 0 |
| 1994 | 0 |
| 1995 | 0 |
| 1996 | 0 |
| 1997 | 0 |
| 1998 | 0 |
| 1999 | 0 |
| 2000 | 0 |
| 2001 | 0 |
| 2002 | 0 |
| 2003 | 0 |
| 2004 | 0 |
| 2005 | 0 |
| 2006 | 0 |
| 2007 | 0 |
| 2008 | 0 |
| 2009 | 0 |
| 2010 | 0 |
| 2011 | 0 |
| 2012 | 0 |
| 2013 | 0 |
| 2014 | 0 |
| 2015 | 0 |
| 2016 | 0 |
| 2017 | 0 |
| 2018 | 0 |
| 2019 | 0 |
| 2020 | 0 |
| 2021 | 0 |
| 2022 | 0 |
| 2023 | 0 |
| 2024 | 0 |
| 2025 | 0 |
| 2026 | 0 |
| 2027 | 0 |
| 2028 | 0 |
| 2029 | 0 |
| 2030 | 0 |
| 2031 | 0 |
| 2032 | 0 |
| 2033 | 0 |
| 2034 | 0 |
| 2035 | 0 |
| 2036 | 0 |
| 2037 | 0 |
| 2038 | 0 |
| 2039 | 0 |
| 2040 | 0 |
| 2041 | 0 |
| 2042 | 0 |
| 2043 | 0 |
| 2044 | 0 |
| 2045 | 0 |
| 2046 | 0 |
| 2047 | 0 |
| 2048 | 0 |
| 2049 | 0 |
| 2050 | 0 |
| 2051 | 0 |
| 2052 | 0 |
| 2053 | 0 |
| 2054 | 0 |
| 2055 | 0 |
| 2056 | 0 |
| 2057 | 0 |
| 2058 | 0 |
| 2059 | 0 |
| 2060 | 0 |
| 2061 | 0 |
| 2062 | 0 |
| 2063 | 0 |
| 2064 | 0 |
| 2065 | 0 |
| 2066 | 0 |
| 2067 | 0 |
| 2068 | 0 |
| 2069 | 0 |
| 2070 | 0 |
| 2071 | 0 |
| 2072 | 0 |
| 2073 | 0 |
| 2074 | 0 |
| 2075 | 0 |
| 2076 | 0 |
| 2077 | 0 |
| 2078 | 0 |
| 2079 | 0 |
| 2080 | 0 |
| 2081 | 0 |
| 2082 | 0 |
| 2083 | 0 |
| 2084 | 0 |
| 2085 | 0 |
| 2086 | 0 |
| 2087 | 0 |
| 2088 | 0 |
| 2089 | 0 |
| 2090 | 0 |
| 2091 | 0 |
| 2092 | 0 |
| 2093 | 0 |
| 2094 | 0 |
| 2095 | 0 |
| 2096 | 0 |
| 2097 | 0 |
| 2098 | 0 |
| 2099 | 0 |
| 2100 | 0 |
| 2101 | 0 |
| 2102 | 0 |
| 2103 | 0 |
| 2104 | 0 |
| 2105 | 0 |
| 2106 | 0 |
| 2107 | 0 |
| 2108 | 0 |
| 2109 | 0 |
| 2110 | 0 |
| 2111 | 0 |
| 2112 | 0 |
| 2113 | 0 |
| 2114 | 0 |
| 2115 | 0 |
| 2116 | 0 |
| 2117 | 0 |
| 2118 | 0 |
| 2119 | 0 |
| 2120 | 0 |
| 2121 | 0 |
| 2122 | 0 |
| 2123 | 0 |
| 2124 | 0 |
| 2125 | 0 |
| 2126 | 0 |
| 2127 | 0 |
| 2128 | 0 |
| 2129 | 0 |
| 2130 | 0 |
| 2131 | 0 |
| 2132 | 0 |
| 2133 | 0 |
| 2134 | 0 |
| 2135 | 0 |
| 2136 | 0 |
| 2137 | 0 |
| 2138 | 0 |
| 2139 | 0 |
| 2140 | 0 |
| 2141 | 0 |
| 2142 | 0 |
| 2143 | 0 |
| 2144 | 0 |
| 2145 | 0 |
| 2146 | 0 |
| 2147 | 0 |
| 2148 | 0 |
| 2149 | 0 |
| 2150 | 0 |
| 2151 | 0 |
| 2152 | 0 |
| 2153 | 0 |
| 2154 | 0 |
| 2155 | 0 |
| 2156 | 0 |
| 2157 | 0 |
| 2158 | 0 |
| 2159 | 0 |
| 2160 | 0 |
| 2161 | 0 |
| 2162 | 0 |
| 2163 | 0 |
| 2164 | 0 |
| 2165 | 0 |
| 2166 | 0 |
| 2167 | 0 |
| 2168 | 0 |
| 2169 | 0 |
| 2170 | 0 |
| 2171 | 0 |
| 2172 | 0 |
| 2173 | 0 |
| 2174 | 0 |
| 2175 | 0 |
| 2176 | 0 |
| 2177 | 0 |
| 2178 | 0 |
| 2179 | 0 |
| 2180 | 0 |
| 2181 | 0 |
| 2182 | 0 |
| 2183 | 0 |
| 2184 | 0 |
| 2185 | 0 |
| 2186 | 0 |
| 2187 | 0 |
| 2188 | 0 |
| 2189 | 0 |
| 2190 | 0 |
| 2191 | 0 |
| 2192 | 0 |
| 2193 | 0 |
| 2194 | 0 |
| 2195 | 0 |
| 2196 | 0 |
| 2197 | 0 |
| 2198 | 0 |
| 2199 | 0 |
| 2200 | 0 |
| 2201 | 0 |
| 2202 | 0 |
| 2203 | 0 |
| 2204 | 0 |
| 2205 | 0 |
| 2206 | 0 |
| 2207 | 0 |
| 2208 | 0 |
| 2209 | 0 |
| 2210 | 0 |
| 2211 | 0 |
| 2212 | 0 |
| 2213 | 0 |
| 2214 | 0 |
| 2215 | 0 |
| 2216 | 0 |
| 2217 | 0 |
| 2218 | 0 |
| 2219 | 0 |
| 2220 | 0 |
| 2221 | 0 |
| 2222 | 0 |
| 2223 | 0 |
| 2224 | 0 |
| 2225 | 0 |
| 2226 | 0 |
| 2227 | 0 |
| 2228 | 0 |
| 2229 | 0 |
| 2230 | 0 |
| 2231 | 0 |
| 2232 | 0 |
| 2233 | 0 |
| 2234 | 0 |
| 2235 | 0 |
| 2236 | 0 |
| 2237 | 0 |
| 2238 | 0 |
| 2239 | 0 |
| 2240 | 0 |
| 2241 | 0 |
| 2242 | 0 |
| 2243 | 0 |
| 2244 | 0 |
| 2245 | 0 |
| 2246 | 0 |
| 2247 | 0 |
| 2248 | 0 |
| 2249 | 0 |
| 2250 | 0 |
| 2251 | 0 |
| 2252 | 0 |
| 2253 | 0 |
| 2254 | 0 |
| 2255 | 0 |
| 2256 | 0 |
| 2257 | 0 |
| 2258 | 0 |
| 2259 | 0 |
| 2260 | 0 |
| 2261 | 0 |
| 2262 | 0 |
| 2263 | 0 |
| 2264 | 0 |
| 2265 | 0 |
| 2266 | 0 |
| 2267 | 0 |
| 2268 | 0 |
| 2269 | 0 |
| 2270 | 0 |
| 2271 | 0 |
| 2272 | 0 |
| 2273 | 0 |
| 2274 | 0 |
| 2275 | 0 |
| 2276 | 0 |
| 2277 | 0 |
| 2278 | 0 |
| 2279 | 0 |
| 2280 | 0 |
| 2281 | 0 |
| 2282 | 0 |
| 2283 | 0 |
| 2284 | 0 |
| 2285 | 0 |
| 2286 | 0 |
| 2287 | 0 |
| 2288 | 0 |
| 2289 | 0 |
| 2290 | 0 |
| 2291 | 0 |
| 2292 | 0 |
| 2293 | 0 |
| 2294 | 0 |
| 2295 | 0 |
| 2296 | 0 |
| 2297 | 0 |
| 2298 | 0 |
| 2299 | 0 |
| 2300 | 0 |
| 2301 | 0 |
| 2302 | 0 |
| 2303 | 0 |
| 2304 | 0 |
| 2305 | 0 |
| 2306 | 0 |
| 2307 | 0 |
| 2308 | 0 |
| 2309 | 0 |
| 2310 | 0 |
| 2311 | 0 |
| 2312 | 0 |
| 2313 | 0 |
| 2314 | 0 |
| 2315 | 0 |
| 2316 | 0 |
| 2317 | 0 |
| 2318 | 0 |
| 2319 | 0 |
| 2320 | 0 |
| 2321 | 0 |
| 2322 | 0 |
| 2323 | 0 |
| 2324 | 0 |
| 2325 | 0 |
| 2326 | 0 |
| 2327 | 0 |
| 2328 | 0 |
| 2329 | 0 |
| 2330 | 0 |
| 2331 | 0 |
| 2332 | 0 |
| 2333 | 0 |
| 2334 | 0 |
| 2335 | 0 |
| 2336 | 0 |
| 2337 | 0 |
| 2338 | 0 |
| 2339 | 0 |
| 2340 | 0 |
| 2341 | 0 |
| 2342 | 0 |
| 2343 | 0 |
| 2344 | 0 |
| 2345 | 0 |
| 2346 | 0 |
| 2347 | 0 |
| 2348 | 0 |
| 2349 | 0 |
| 2350 | 0 |
| 2351 | 0 |
| 2352 | 0 |
| 2353 | 0 |
| 2354 | 0 |
| 2355 | 0 |
| 2356 | 0 |
| 2357 | 0 |
| 2358 | 0 |
| 2359 | 0 |
| 2360 | 0 |
| 2361 | 0 |
| 2362 | 0 |
| 2363 | 0 |
| 2364 | 0 |
| 2365 | 0 |
| 2366 | 0 |
| 2367 | 0 |
| 2368 | 0 |
| 2369 | 0 |
| 2370 | 0 |
| 2371 | 0 |
| 2372 | 0 |
| 2373 | 0 |
| 2374 | 0 |
| 2375 | 0 |
| 2376 | 0 |
| 2377 | 0 |
| 2378 | 0 |
| 2379 | 0 |
| 2380 | 0 |
| 2381 | 0 |
| 2382 | 0 |
| 2383 | 0 |
| 2384 | 0 |
| 2385 | 0 |
| 2386 | 0 |
| 2387 | 0 |
| 2388 | 0 |
| 2389 | 0 |
| 2390 | 0 |
| 2391 | 0 |
| 2392 | 0 |
| 2393 | 0 |
| 2394 | 0 |
| 2395 | 0 |
| 2396 | 0 |
| 2397 | 0 |
| 2398 | 0 |
| 2399 | 0 |
| 2400 | 0 |
| 2401 | 0 |
| 2402 | 0 |
| 2403 | 0 |
| 2404 | 0 |
| 2405 | 0 |
| 2406 | 0 |
| 2407 | 0.001 |
| 2408 | 0 |
| 2409 | 0 |
| 2410 | 0 |
| 2411 | 0 |
| 2412 | 0 |
| 2413 | 0 |
| 2414 | 0 |
| 2415 | 0 |
| 2416 | 0 |
| 2417 | 0 |
| 2418 | 0 |
| 2419 | 0 |
| 2420 | 0 |
| 2421 | 0 |
| 2422 | 0 |
| 2423 | 0 |
| 2424 | 0 |
| 2425 | 0 |
| 2426 | 0 |
| 2427 | 0 |
| 2428 | 0 |
| 2429 | 0 |
| 2430 | 0 |
| 2431 | 0 |
| 2432 | 0 |
| 2433 | 0 |
| 2434 | 0 |
| 2435 | 0 |
| 2436 | 0 |
| 2437 | 0 |
| 2438 | 0 |
| 2439 | 0 |
| 2440 | 0 |
| 2441 | 0 |
| 2442 | 0 |
| 2443 | 0 |
| 2444 | 0 |
| 2445 | 0 |
| 2446 | 0 |
| 2447 | 0 |
| 2448 | 0 |
| 2449 | 0.001 |
| 2450 | 0 |
| 2451 | 0 |
| 2452 | 0 |
| 2453 | 0 |
| 2454 | 0 |
| 2455 | 0 |
| 2456 | 0 |
| 2457 | 0.001 |
| 2458 | 0 |
| 2459 | 0 |
| 2460 | 0 |
| 2461 | 0 |
| 2462 | 0 |
| 2463 | 0 |
| 2464 | 0 |
| 2465 | 0 |
| 2466 | 0 |
| 2467 | 0 |
| 2468 | 0 |
| 2469 | 0 |
| 2470 | 0 |
| 2471 | 0 |
| 2472 | 0 |
| 2473 | 0 |
| 2474 | 0 |
| 2475 | 0 |
| 2476 | 0 |
| 2477 | 0 |
| 2478 | 0 |
| 2479 | 0 |
| 2480 | 0 |
| 2481 | 0 |
| 2482 | 0 |
| 2483 | 0 |
| 2484 | 0 |
| 2485 | 0 |
| 2486 | 0 |
| 2487 | 0 |
| 2488 | 0 |
| 2489 | 0 |
| 2490 | 0 |
| 2491 | 0 |
| 2492 | 0 |
| 2493 | 0 |
| 2494 | 0 |
| 2495 | 0 |
| 2496 | 0 |
| 2497 | 0 |
| 2498 | 0 |
| 2499 | 0.001 |
| 2500 | 0 |
| 2501 | 0 |
| 2502 | 0 |
| 2503 | 0 |
| 2504 | 0.001 |
| 2505 | 0 |
| 2506 | 0 |
| 2507 | 0 |
| 2508 | 0 |
| 2509 | 0 |
| 2510 | 0 |
| 2511 | 0 |
| 2512 | 0 |
| 2513 | 0 |
| 2514 | 0 |
| 2515 | 0 |
| 2516 | 0 |
| 2517 | 0 |
| 2518 | 0 |
| 2519 | 0 |
| 2520 | 0 |
| 2521 | 0 |
| 2522 | 0 |
| 2523 | 0 |
| 2524 | 0 |
| 2525 | 0 |
| 2526 | 0 |
| 2527 | 0 |
| 2528 | 0 |
| 2529 | 0 |
| 2530 | 0 |
| 2531 | 0 |
| 2532 | 0 |
| 2533 | 0 |
| 2534 | 0 |
| 2535 | 0 |
| 2536 | 0 |
| 2537 | 0 |
| 2538 | 0 |
| 2539 | 0 |
| 2540 | 0 |
| 2541 | 0 |
| 2542 | 0 |
| 2543 | 0 |
| 2544 | 0 |
| 2545 | 0 |
| 2546 | 0 |
| 2547 | 0 |
| 2548 | 0 |
| 2549 | 0 |
| 2550 | 0 |
| 2551 | 0 |
| 2552 | 0 |
| 2553 | 0 |
| 2554 | 0.001 |
| 2555 | 0 |
| 2556 | 0 |
| 2557 | 0 |
| 2558 | 0 |
| 2559 | 0 |
| 2560 | 0 |
| 2561 | 0 |
| 2562 | 0 |
| 2563 | 0 |
| 2564 | 0 |
| 2565 | 0 |
| 2566 | 0 |
| 2567 | 0 |
| 2568 | 0 |
| 2569 | 0 |
| 2570 | 0 |
| 2571 | 0 |
| 2572 | 0 |
| 2573 | 0 |
| 2574 | 0 |
| 2575 | 0 |
| 2576 | 0 |
| 2577 | 0 |
| 2578 | 0 |
| 2579 | 0 |
| 2580 | 0 |
| 2581 | 0 |
| 2582 | 0 |
| 2583 | 0 |
| 2584 | 0.002 |
| 2585 | 0 |
| 2586 | 0 |
| 2587 | 0 |
| 2588 | 0 |
| 2589 | 0 |
| 2590 | 0 |
| 2591 | 0 |
| 2592 | 0 |
| 2593 | 0 |
| 2594 | 0 |
| 2595 | 0 |
| 2596 | 0 |
| 2597 | 0 |
| 2598 | 0 |
| 2599 | 0 |
| 2600 | 0 |
| 2601 | 0 |
| 2602 | 0 |
| 2603 | 0 |
| 2604 | 0.005 |
| 2605 | 0 |
| 2606 | 0 |
| 2607 | 0 |
| 2608 | 0 |
| 2609 | 0 |
| 2610 | 0.001 |
| 2611 | 0 |
| 2612 | 0 |
| 2613 | 0 |
| 2614 | 0 |
| 2615 | 0 |
| 2616 | 0 |
| 2617 | 0 |
| 2618 | 0 |
| 2619 | 0 |
| 2620 | 0 |
| 2621 | 0 |
| 2622 | 0 |
| 2623 | 0 |
| 2624 | 0 |
| 2625 | 0 |
| 2626 | 0 |
| 2627 | 0 |
| 2628 | 0 |
| 2629 | 0 |
| 2630 | 0 |
| 2631 | 0 |
| 2632 | 0.001 |
| 2633 | 0 |
| 2634 | 0.002 |
| 2635 | 0 |
| 2636 | 0 |
| 2637 | 0 |
| 2638 | 0 |
| 2639 | 0 |
| 2640 | 0 |
| 2641 | 0 |
| 2642 | 0.001 |
| 2643 | 0 |
| 2644 | 0 |
| 2645 | 0 |
| 2646 | 0 |
| 2647 | 0 |
| 2648 | 0 |
| 2649 | 0 |
| 2650 | 0 |
| 2651 | 0 |
| 2652 | 0.002 |
| 2653 | 0 |
| 2654 | 0.006 |
| 2655 | 0 |
| 2656 | 0 |
| 2657 | 0 |
| 2658 | 0 |
| 2659 | 0 |
| 2660 | 0 |
| 2661 | 0 |
| 2662 | 0 |
| 2663 | 0 |
| 2664 | 0 |
| 2665 | 0 |
| 2666 | 0 |
| 2667 | 0 |
| 2668 | 0 |
| 2669 | 0 |
| 2670 | 0 |
| 2671 | 0 |
| 2672 | 0 |
| 2673 | 0 |
| 2674 | 0 |
| 2675 | 0 |
| 2676 | 0 |
| 2677 | 0 |
| 2678 | 0 |
| 2679 | 0 |
| 2680 | 0 |
| 2681 | 0 |
| 2682 | 0 |
| 2683 | 0 |
| 2684 | 0 |
| 2685 | 0 |
| 2686 | 0 |
| 2687 | 0.001 |
| 2688 | 0 |
| 2689 | 0 |
| 2690 | 0 |
| 2691 | 0 |
| 2692 | 0 |
| 2693 | 0 |
| 2694 | 0.001 |
| 2695 | 0 |
| 2696 | 0 |
| 2697 | 0 |
| 2698 | 0 |
| 2699 | 0 |
| 2700 | 0 |
| 2701 | 0 |
| 2702 | 0.001 |
| 2703 | 0 |
| 2704 | 0 |
| 2705 | 0 |
| 2706 | 0 |
| 2707 | 0.001 |
| 2708 | 0 |
| 2709 | 0 |
| 2710 | 0 |
| 2711 | 0 |
| 2712 | 0 |
| 2713 | 0 |
| 2714 | 0 |
| 2715 | 0 |
| 2716 | 0 |
| 2717 | 0 |
| 2718 | 0 |
| 2719 | 0 |
| 2720 | 0 |
| 2721 | 0 |
| 2722 | 0 |
| 2723 | 0 |
| 2724 | 0 |
| 2725 | 0 |
| 2726 | 0 |
| 2727 | 0 |
| 2728 | 0 |
| 2729 | 0.001 |
| 2730 | 0 |
| 2731 | 0.001 |
| 2732 | 0 |
| 2733 | 0 |
| 2734 | 0 |
| 2735 | 0 |
| 2736 | 0 |
| 2737 | 0.001 |
| 2738 | 0 |
| 2739 | 0 |
| 2740 | 0 |
| 2741 | 0 |
| 2742 | 0 |
| 2743 | 0 |
| 2744 | 0 |
| 2745 | 0 |
| 2746 | 0 |
| 2747 | 0 |
| 2748 | 0 |
| 2749 | 0.001 |
| 2750 | 0 |
| 2751 | 0 |
| 2752 | 0 |
| 2753 | 0 |
| 2754 | 0 |
| 2755 | 0 |
| 2756 | 0 |
| 2757 | 0.001 |
| 2758 | 0 |
| 2759 | 0 |
| 2760 | 0 |
| 2761 | 0 |
| 2762 | 0 |
| 2763 | 0 |
| 2764 | 0 |
| 2765 | 0 |
| 2766 | 0 |
| 2767 | 0.001 |
| 2768 | 0 |
| 2769 | 0 |
| 2770 | 0 |
| 2771 | 0 |
| 2772 | 0 |
| 2773 | 0.001 |
| 2774 | 0 |
| 2775 | 0 |
| 2776 | 0 |
| 2777 | 0 |
| 2778 | 0 |
| 2779 | 0.001 |
| 2780 | 0 |
| 2781 | 0 |
| 2782 | 0 |
| 2783 | 0 |
| 2784 | 0 |
| 2785 | 0 |
| 2786 | 0 |
| 2787 | 0.005 |
| 2788 | 0 |
| 2789 | 0 |
| 2790 | 0 |
| 2791 | 0 |
| 2792 | 0 |
| 2793 | 0 |
| 2794 | 0 |
| 2795 | 0.001 |
| 2796 | 0 |
| 2797 | 0 |
| 2798 | 0 |
| 2799 | 0.001 |
| 2800 | 0 |
| 2801 | 0 |
| 2802 | 0 |
| 2803 | 0 |
| 2804 | 0 |
| 2805 | 0 |
| 2806 | 0 |
| 2807 | 0.01 |
| 2808 | 0 |
| 2809 | 0.001 |
| 2810 | 0 |
| 2811 | 0 |
| 2812 | 0 |
| 2813 | 0 |
| 2814 | 0 |
| 2815 | 0 |
| 2816 | 0 |
| 2817 | 0.001 |
| 2818 | 0 |
| 2819 | 0 |
| 2820 | 0 |
| 2821 | 0 |
| 2822 | 0 |
| 2823 | 0 |
| 2824 | 0 |
| 2825 | 0 |
| 2826 | 0 |
| 2827 | 0 |
| 2828 | 0.001 |
| 2829 | 0.005 |
| 2830 | 0 |
| 2831 | 0 |
| 2832 | 0 |
| 2833 | 0 |
| 2834 | 0 |
| 2835 | 0 |
| 2836 | 0 |
| 2837 | 0.003 |
| 2838 | 0 |
| 2839 | 0 |
| 2840 | 0 |
| 2841 | 0 |
| 2842 | 0 |
| 2843 | 0 |
| 2844 | 0 |
| 2845 | 0 |
| 2846 | 0 |
| 2847 | 0 |
| 2848 | 0 |
| 2849 | 0.011 |
| 2850 | 0 |
| 2851 | 0 |
| 2852 | 0 |
| 2853 | 0 |
| 2854 | 0.001 |
| 2855 | 0 |
| 2856 | 0 |
| 2857 | 0.003 |
| 2858 | 0 |
| 2859 | 0 |
| 2860 | 0 |
| 2861 | 0 |
| 2862 | 0 |
| 2863 | 0 |
| 2864 | 0.001 |
| 2865 | 0 |
| 2866 | 0 |
| 2867 | 0 |
| 2868 | 0 |
| 2869 | 0 |
| 2870 | 0 |
| 2871 | 0 |
| 2872 | 0 |
| 2873 | 0 |
| 2874 | 0 |
| 2875 | 0 |
| 2876 | 0 |
| 2877 | 0 |
| 2878 | 0.001 |
| 2879 | 0.002 |
| 2880 | 0 |
| 2881 | 0 |
| 2882 | 0 |
| 2883 | 0 |
| 2884 | 0.004 |
| 2885 | 0 |
| 2886 | 0 |
| 2887 | 0 |
| 2888 | 0 |
| 2889 | 0 |
| 2890 | 0 |
| 2891 | 0 |
| 2892 | 0.001 |
| 2893 | 0 |
| 2894 | 0 |
| 2895 | 0 |
| 2896 | 0 |
| 2897 | 0 |
| 2898 | 0 |
| 2899 | 0.003 |
| 2900 | 0 |
| 2901 | 0 |
| 2902 | 0 |
| 2903 | 0 |
| 2904 | 0.008 |
| 2905 | 0 |
| 2906 | 0 |
| 2907 | 0 |
| 2908 | 0.002 |
| 2909 | 0 |
| 2910 | 0 |
| 2911 | 0 |
| 2912 | 0 |
| 2913 | 0 |
| 2914 | 0.001 |
| 2915 | 0 |
| 2916 | 0.001 |
| 2917 | 0 |
| 2918 | 0 |
| 2919 | 0 |
| 2920 | 0 |
| 2921 | 0 |
| 2922 | 0 |
| 2923 | 0 |
| 2924 | 0 |
| 2925 | 0 |
| 2926 | 0 |
| 2927 | 0 |
| 2928 | 0.005 |
| 2929 | 0 |
| 2930 | 0 |
| 2931 | 0 |
| 2932 | 0 |
| 2933 | 0 |
| 2934 | 0.003 |
| 2935 | 0 |
| 2936 | 0 |
| 2937 | 0 |
| 2938 | 0 |
| 2939 | 0 |
| 2940 | 0 |
| 2941 | 0 |
| 2942 | 0.001 |
| 2943 | 0 |
| 2944 | 0 |
| 2945 | 0 |
| 2946 | 0 |
| 2947 | 0 |
| 2948 | 0 |
| 2949 | 0 |
| 2950 | 0 |
| 2951 | 0 |
| 2952 | 0.001 |
| 2953 | 0 |
| 2954 | 0.007 |
| 2955 | 0 |
| 2956 | 0 |
| 2957 | 0 |
| 2958 | 0.001 |
| 2959 | 0 |
| 2960 | 0 |
| 2961 | 0 |
| 2962 | 0 |
| 2963 | 0 |
| 2964 | 0.005 |
| 2965 | 0 |
| 2966 | 0 |
| 2967 | 0 |
| 2968 | 0 |
| 2969 | 0 |
| 2970 | 0 |
| 2971 | 0 |
| 2972 | 0.003 |
| 2973 | 0 |
| 2974 | 0 |
| 2975 | 0 |
| 2976 | 0.001 |
| 2977 | 0 |
| 2978 | 0.002 |
| 2979 | 0 |
| 2980 | 0 |
| 2981 | 0 |
| 2982 | 0 |
| 2983 | 0 |
| 2984 | 0.029 |
| 2985 | 0 |
| 2986 | 0 |
| 2987 | 0 |
| 2988 | 0 |
| 2989 | 0 |
| 2990 | 0.001 |
| 2991 | 0 |
| 2992 | 0.007 |
| 2993 | 0 |
| 2994 | 0 |
| 2995 | 0 |
| 2996 | 0 |
| 2997 | 0 |
| 2998 | 0 |
| 2999 | 0 |
| 3000 | 0 |
| 3001 | 0 |
| 3002 | 0.001 |
| 3003 | 0 |
| 3004 | 0.066 |
| 3005 | 0 |
| 3006 | 0 |
| 3007 | 0 |
| 3008 | 0 |
| 3009 | 0 |
| 3010 | 0.002 |
| 3011 | 0 |
| 3012 | 0 |
| 3013 | 0 |
| 3014 | 0.002 |
| 3015 | 0 |
| 3016 | 0 |
| 3017 | 0 |
| 3018 | 0 |
| 3019 | 0 |
| 3020 | 0 |
| 3021 | 0 |
| 3022 | 0.001 |
| 3023 | 0 |
| 3024 | 0 |
| 3025 | 0 |
| 3026 | 0 |
| 3027 | 0 |
| 3028 | 0 |
| 3029 | 0 |
| 3030 | 0 |
| 3031 | 0 |
| 3032 | 0.003 |
| 3033 | 0 |
| 3034 | 0.009 |
| 3035 | 0 |
| 3036 | 0 |
| 3037 | 0 |
| 3038 | 0 |
| 3039 | 0 |
| 3040 | 0.001 |
| 3041 | 0 |
| 3042 | 0.002 |
| 3043 | 0 |
| 3044 | 0 |
| 3045 | 0 |
| 3046 | 0 |
| 3047 | 0 |
| 3048 | 0 |
| 3049 | 0 |
| 3050 | 0 |
| 3051 | 0 |
| 3052 | 0.006 |
| 3053 | 0 |
| 3054 | 0.021 |
| 3055 | 0 |
| 3056 | 0 |
| 3057 | 0 |
| 3058 | 0 |
| 3059 | 0 |
| 3060 | 0 |
| 3061 | 0 |
| 3062 | 0 |
| 3063 | 0 |
| 3064 | 0 |
| 3065 | 0 |
| 3066 | 0 |
| 3067 | 0 |
| 3068 | 0 |
| 3069 | 0 |
| 3070 | 0 |
| 3071 | 0 |
| 3072 | 0 |
| 3073 | 0 |
| 3074 | 0.001 |
| 3075 | 0 |
| 3076 | 0 |
| 3077 | 0 |
| 3078 | 0 |
| 3079 | 0 |
| 3080 | 0 |
| 3081 | 0 |
| 3082 | 0 |
| 3083 | 0 |
| 3084 | 0 |
| 3085 | 0 |
| 3086 | 0 |
| 3087 | 0.002 |
| 3088 | 0 |
| 3089 | 0 |
| 3090 | 0 |
| 3091 | 0 |
| 3092 | 0 |
| 3093 | 0 |
| 3094 | 0.002 |
| 3095 | 0 |
| 3096 | 0 |
| 3097 | 0 |
| 3098 | 0 |
| 3099 | 0 |
| 3100 | 0 |
| 3101 | 0 |
| 3102 | 0 |
| 3103 | 0 |
| 3104 | 0 |
| 3105 | 0 |
| 3106 | 0 |
| 3107 | 0.005 |
| 3108 | 0 |
| 3109 | 0 |
| 3110 | 0 |
| 3111 | 0.001 |
| 3112 | 0 |
| 3113 | 0 |
| 3114 | 0 |
| 3115 | 0 |
| 3116 | 0 |
| 3117 | 0 |
| 3118 | 0 |
| 3119 | 0 |
| 3120 | 0 |
| 3121 | 0 |
| 3122 | 0 |
| 3123 | 0 |
| 3124 | 0 |
| 3125 | 0 |
| 3126 | 0 |
| 3127 | 0 |
| 3128 | 0 |
| 3129 | 0.002 |
| 3130 | 0 |
| 3131 | 0.003 |
| 3132 | 0 |
| 3133 | 0 |
| 3134 | 0 |
| 3135 | 0 |
| 3136 | 0 |
| 3137 | 0.002 |
| 3138 | 0 |
| 3139 | 0 |
| 3140 | 0 |
| 3141 | 0 |
| 3142 | 0 |
| 3143 | 0 |
| 3144 | 0 |
| 3145 | 0 |
| 3146 | 0 |
| 3147 | 0 |
| 3148 | 0 |
| 3149 | 0.005 |
| 3150 | 0 |
| 3151 | 0 |
| 3152 | 0 |
| 3153 | 0.001 |
| 3154 | 0 |
| 3155 | 0 |
| 3156 | 0 |
| 3157 | 0.002 |
| 3158 | 0 |
| 3159 | 0 |
| 3160 | 0 |
| 3161 | 0 |
| 3162 | 0 |
| 3163 | 0 |
| 3164 | 0 |
| 3165 | 0 |
| 3166 | 0 |
| 3167 | 0.003 |
| 3168 | 0 |
| 3169 | 0 |
| 3170 | 0 |
| 3171 | 0 |
| 3172 | 0 |
| 3173 | 0.003 |
| 3174 | 0 |
| 3175 | 0.002 |
| 3176 | 0 |
| 3177 | 0 |
| 3178 | 0 |
| 3179 | 0.001 |
| 3180 | 0 |
| 3181 | 0 |
| 3182 | 0 |
| 3183 | 0 |
| 3184 | 0.001 |
| 3185 | 0 |
| 3186 | 0 |
| 3187 | 0.017 |
| 3188 | 0 |
| 3189 | 0 |
| 3190 | 0 |
| 3191 | 0 |
| 3192 | 0 |
| 3193 | 0 |
| 3194 | 0 |
| 3195 | 0.004 |
| 3196 | 0 |
| 3197 | 0 |
| 3198 | 0 |
| 3199 | 0.002 |
| 3200 | 0 |
| 3201 | 0 |
| 3202 | 0 |
| 3203 | 0 |
| 3204 | 0.001 |
| 3205 | 0 |
| 3206 | 0 |
| 3207 | 0.037 |
| 3208 | 0.001 |
| 3209 | 0.003 |
| 3210 | 0 |
| 3211 | 0 |
| 3212 | 0 |
| 3213 | 0 |
| 3214 | 0 |
| 3215 | 0 |
| 3216 | 0 |
| 3217 | 0.002 |
| 3218 | 0 |
| 3219 | 0 |
| 3220 | 0 |
| 3221 | 0 |
| 3222 | 0 |
| 3223 | 0 |
| 3224 | 0 |
| 3225 | 0 |
| 3226 | 0 |
| 3227 | 0 |
| 3228 | 0.002 |
| 3229 | 0.018 |
| 3230 | 0 |
| 3231 | 0 |
| 3232 | 0 |
| 3233 | 0 |
| 3234 | 0.001 |
| 3235 | 0 |
| 3236 | 0 |
| 3237 | 0.004 |
| 3238 | 0 |
| 3239 | 0 |
| 3240 | 0 |
| 3241 | 0 |
| 3242 | 0 |
| 3243 | 0 |
| 3244 | 0 |
| 3245 | 0 |
| 3246 | 0 |
| 3247 | 0 |
| 3248 | 0 |
| 3249 | 0.039 |
| 3250 | 0 |
| 3251 | 0 |
| 3252 | 0.001 |
| 3253 | 0 |
| 3254 | 0.002 |
| 3255 | 0 |
| 3256 | 0 |
| 3257 | 0 |
| 3258 | 0.001 |
| 3259 | 0 |
| 3260 | 0 |
| 3261 | 0 |
| 3262 | 0 |
| 3263 | 0 |
| 3264 | 0.002 |
| 3265 | 0 |
| 3266 | 0 |
| 3267 | 0 |
| 3268 | 0 |
| 3269 | 0 |
| 3270 | 0 |
| 3271 | 0 |
| 3272 | 0.001 |
| 3273 | 0 |
| 3274 | 0 |
| 3275 | 0 |
| 3276 | 0 |
| 3277 | 0 |
| 3278 | 0.001 |
| 3279 | 0 |
| 3280 | 0 |
| 3281 | 0 |
| 3282 | 0 |
| 3283 | 0 |
| 3284 | 0.013 |
| 3285 | 0 |
| 3286 | 0 |
| 3287 | 0 |
| 3288 | 0.001 |
| 3289 | 0 |
| 3290 | 0 |
| 3291 | 0 |
| 3292 | 0.003 |
| 3293 | 0 |
| 3294 | 0 |
| 3295 | 0 |
| 3296 | 0.001 |
| 3297 | 0 |
| 3298 | 0 |
| 3299 | 0 |
| 3300 | 0 |
| 3301 | 0 |
| 3302 | 0 |
| 3303 | 0 |
| 3304 | 0.03 |
| 3305 | 0 |
| 3306 | 0 |
| 3307 | 0 |
| 3308 | 0.009 |
| 3309 | 0 |
| 3310 | 0 |
| 3311 | 0 |
| 3312 | 0 |
| 3313 | 0 |
| 3314 | 0.001 |
| 3315 | 0 |
| 3316 | 0.002 |
| 3317 | 0 |
| 3318 | 0 |
| 3319 | 0 |
| 3320 | 0 |
| 3321 | 0 |
| 3322 | 0.001 |
| 3323 | 0 |
| 3324 | 0 |
| 3325 | 0 |
| 3326 | 0 |
| 3327 | 0 |
| 3328 | 0.019 |
| 3329 | 0 |
| 3330 | 0 |
| 3331 | 0 |
| 3332 | 0 |
| 3333 | 0 |
| 3334 | 0.006 |
| 3335 | 0 |
| 3336 | 0 |
| 3337 | 0 |
| 3338 | 0 |
| 3339 | 0 |
| 3340 | 0 |
| 3341 | 0 |
| 3342 | 0.001 |
| 3343 | 0 |
| 3344 | 0.001 |
| 3345 | 0 |
| 3346 | 0 |
| 3347 | 0 |
| 3348 | 0 |
| 3349 | 0 |
| 3350 | 0 |
| 3351 | 0 |
| 3352 | 0.002 |
| 3353 | 0 |
| 3354 | 0.014 |
| 3355 | 0 |
| 3356 | 0 |
| 3357 | 0 |
| 3358 | 0 |
| 3359 | 0 |
| 3360 | 0 |
| 3361 | 0 |
| 3362 | 0 |
| 3363 | 0 |
| 3364 | 0.018 |
| 3365 | 0 |
| 3366 | 0 |
| 3367 | 0 |
| 3368 | 0 |
| 3369 | 0 |
| 3370 | 0 |
| 3371 | 0 |
| 3372 | 0.011 |
| 3373 | 0 |
| 3374 | 0 |
| 3375 | 0 |
| 3376 | 0 |
| 3377 | 0 |
| 3378 | 0 |
| 3379 | 0 |
| 3380 | 0.001 |
| 3381 | 0 |
| 3382 | 0 |
| 3383 | 0 |
| 3384 | 0.105 |
| 3385 | 0 |
| 3386 | 0 |
| 3387 | 0 |
| 3388 | 0 |
| 3389 | 0 |
| 3390 | 0 |
| 3391 | 0 |
| 3392 | 0.024 |
| 3393 | 0 |
| 3394 | 0 |
| 3395 | 0 |
| 3396 | 0 |
| 3397 | 0 |
| 3398 | 0 |
| 3399 | 0 |
| 3400 | 0 |
| 3401 | 0 |
| 3402 | 0 |
| 3403 | 0 |
| 3404 | 0.236 |